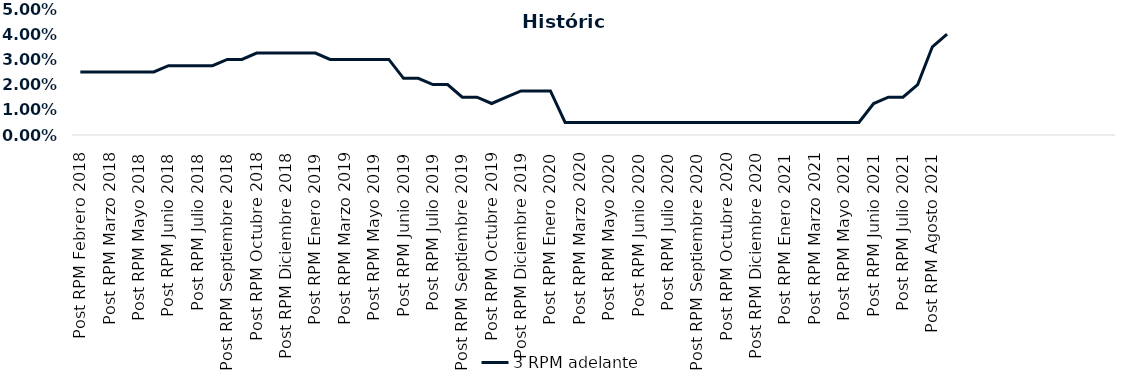
| Category | 3 RPM adelante |
|---|---|
| Post RPM Febrero 2018 | 0.025 |
| Pre RPM Marzo 2018 | 0.025 |
| Post RPM Marzo 2018 | 0.025 |
| Pre RPM Mayo 2018 | 0.025 |
| Post RPM Mayo 2018 | 0.025 |
| Pre RPM Junio 2018 | 0.025 |
| Post RPM Junio 2018 | 0.028 |
| Pre RPM Julio 2018 | 0.028 |
| Post RPM Julio 2018 | 0.028 |
| Pre RPM Septiembre 2018 | 0.028 |
| Post RPM Septiembre 2018 | 0.03 |
| Pre RPM Octubre 2018 | 0.03 |
| Post RPM Octubre 2018 | 0.032 |
| Pre RPM Diciembre 2018 | 0.032 |
| Post RPM Diciembre 2018 | 0.032 |
| Pre RPM Enero 2019 | 0.032 |
| Post RPM Enero 2019 | 0.032 |
| Pre RPM Marzo 2019 | 0.03 |
| Post RPM Marzo 2019 | 0.03 |
| Pre RPM Mayo 2019 | 0.03 |
| Post RPM Mayo 2019 | 0.03 |
| Pre RPM Junio 2019 | 0.03 |
| Post RPM Junio 2019 | 0.022 |
| Pre RPM Julio 2019 | 0.022 |
| Post RPM Julio 2019 | 0.02 |
| Pre RPM Septiembre 2019 | 0.02 |
| Post RPM Septiembre 2019 | 0.015 |
| Pre RPM Octubre 2019 | 0.015 |
| Post RPM Octubre 2019 | 0.012 |
| Pre RPM Diciembre 2019 | 0.015 |
| Post RPM Diciembre 2019 | 0.018 |
| Pre RPM Enero 2020 | 0.018 |
| Post RPM Enero 2020 | 0.018 |
| Pre RPM Marzo 2020 | 0.005 |
| Post RPM Marzo 2020 | 0.005 |
| Pre RPM Mayo 2020 | 0.005 |
| Post RPM Mayo 2020 | 0.005 |
| Pre RPM Junio 2020 | 0.005 |
| Post RPM Junio 2020 | 0.005 |
| Pre RPM Julio 2020 | 0.005 |
| Post RPM Julio 2020 | 0.005 |
| Pre RPM Septiembre 2020 | 0.005 |
| Post RPM Septiembre 2020 | 0.005 |
| Pre RPM Octubre 2020 | 0.005 |
| Post RPM Octubre 2020 | 0.005 |
| Pre RPM Diciembre 2020 | 0.005 |
| Post RPM Diciembre 2020 | 0.005 |
| Pre RPM Enero 2021 | 0.005 |
| Post RPM Enero 2021 | 0.005 |
| Pre RPM Marzo 2021 | 0.005 |
| Post RPM Marzo 2021 | 0.005 |
| Pre RPM Mayo 2021 | 0.005 |
| Post RPM Mayo 2021 | 0.005 |
| Pre RPM Junio 2021 | 0.005 |
| Post RPM Junio 2021 | 0.012 |
| Pre RPM Julio 2021 | 0.015 |
| Post RPM Julio 2021 | 0.015 |
| Pre RPM Agosto 2021 | 0.02 |
| Post RPM Agosto 2021 | 0.035 |
| Pre RPM Octubre 2021 | 0.04 |